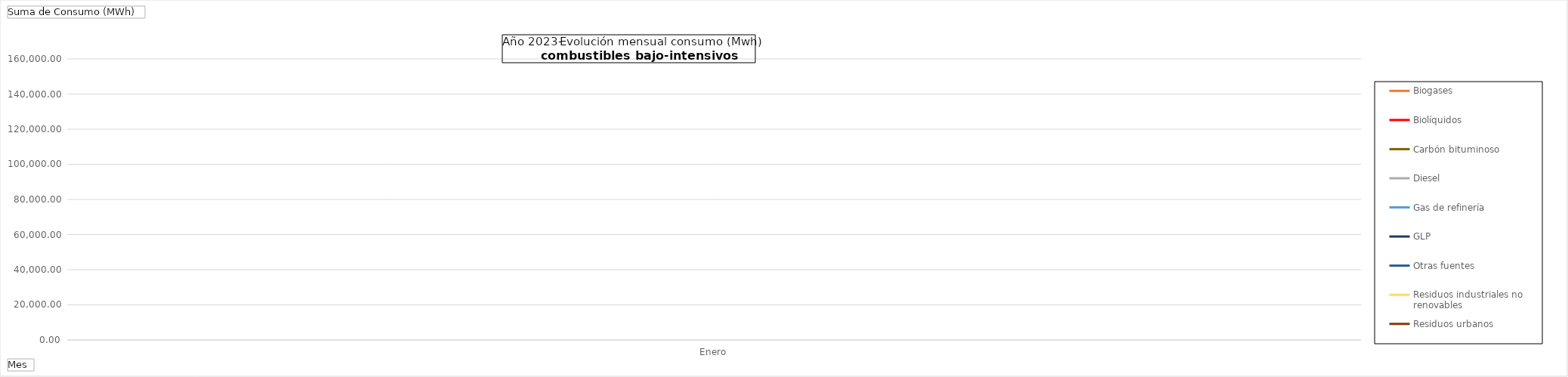
| Category | Biogases | Biolíquidos | Carbón bituminoso | Diesel | Gas de refinería | GLP | Otras fuentes | Residuos industriales no renovables | Residuos urbanos |
|---|---|---|---|---|---|---|---|---|---|
| Enero | 40679.62 | 611.97 | 142556.38 | 6332.64 | 33860 | 70607.36 | 27154.52 | 0 | 89966.49 |